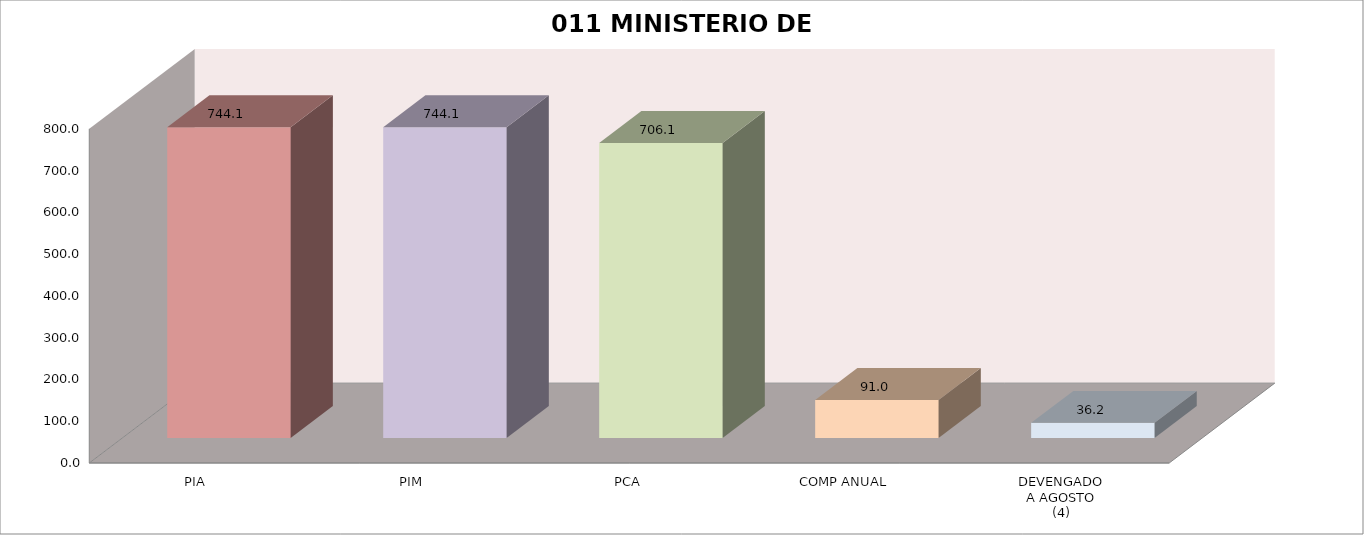
| Category | 011 MINISTERIO DE SALUD |
|---|---|
| PIA | 744.088 |
| PIM | 744.088 |
| PCA | 706.088 |
| COMP ANUAL | 91.048 |
| DEVENGADO
A AGOSTO
(4) | 36.202 |